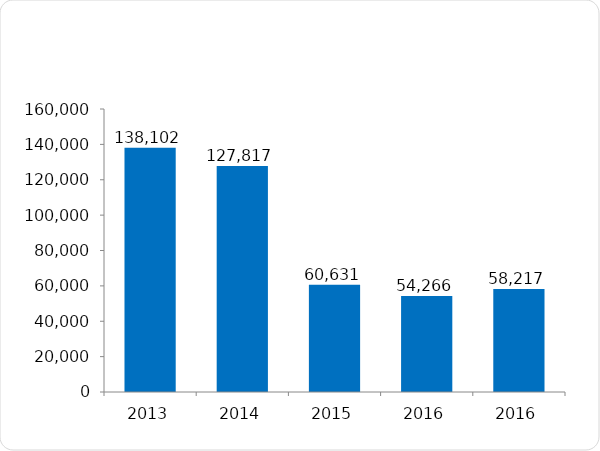
| Category | Personas Capacitadas |
|---|---|
| 2013 | 138102 |
| 2014 | 127817 |
| 2015 | 60631 |
| 2016 | 54266 |
| 2016 | 58217 |